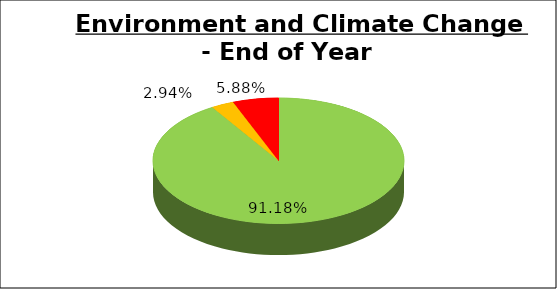
| Category | Q4 |
|---|---|
| Green | 0.912 |
| Amber | 0.029 |
| Red | 0.059 |